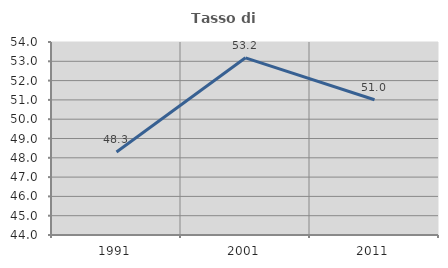
| Category | Tasso di occupazione   |
|---|---|
| 1991.0 | 48.297 |
| 2001.0 | 53.18 |
| 2011.0 | 51.005 |